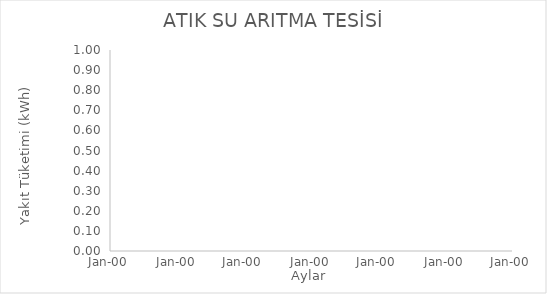
| Category | yakıt tüketimi
(kwh) |
|---|---|
|  | 0 |
|  | 0 |
|  | 0 |
|  | 0 |
|  | 0 |
|  | 0 |
|  | 0 |
|  | 0 |
|  | 0 |
|  | 0 |
|  | 0 |
|  | 0 |
|  | 0 |
|  | 0 |